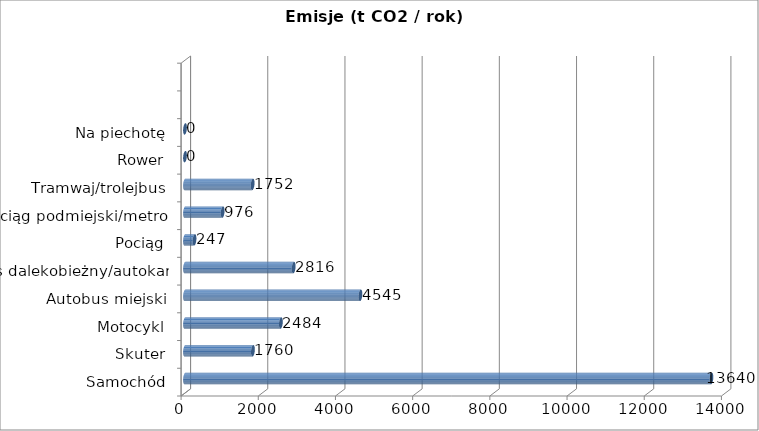
| Category | Emisje (t CO2/rok) |
|---|---|
| Samochód | 13639.873 |
| Skuter | 1759.782 |
| Motocykl | 2484.397 |
| Autobus miejski | 4545.389 |
| Autobus dalekobieżny/autokar | 2815.962 |
| Pociąg | 246.572 |
| Pociąg podmiejski/metro | 976.013 |
| Tramwaj/trolejbus | 1752.154 |
| Rower | 0 |
| Na piechotę | 0 |